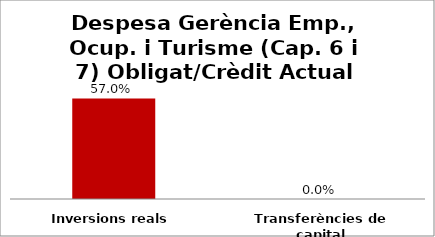
| Category | Series 0 |
|---|---|
| Inversions reals | 0.57 |
| Transferències de capital | 0 |